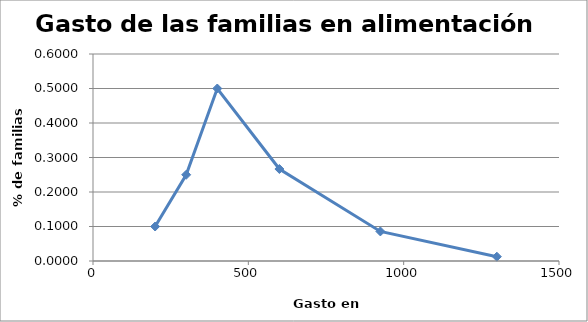
| Category | Series 0 |
|---|---|
| 200.0 | 0.1 |
| 300.0 | 0.25 |
| 400.0 | 0.5 |
| 600.0 | 0.267 |
| 925.0 | 0.086 |
| 1300.0 | 0.012 |